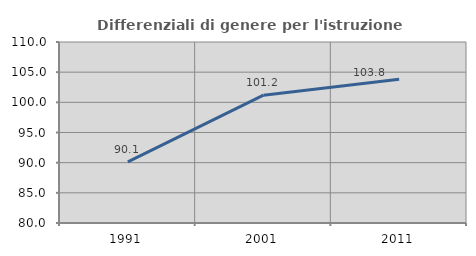
| Category | Differenziali di genere per l'istruzione superiore |
|---|---|
| 1991.0 | 90.142 |
| 2001.0 | 101.189 |
| 2011.0 | 103.834 |